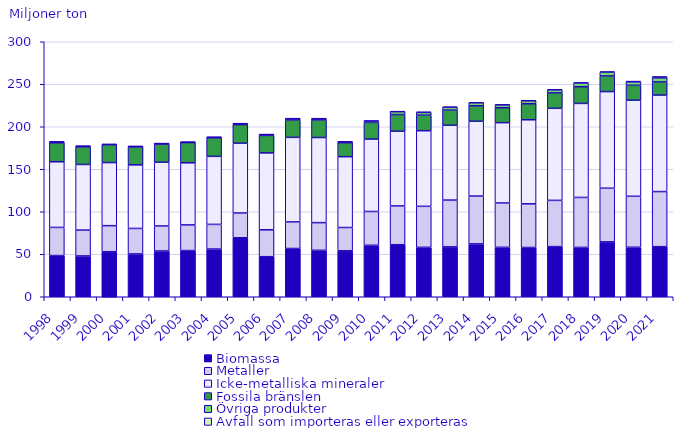
| Category | Biomassa | Metaller | Icke-metalliska mineraler | Fossila bränslen | Övriga produkter | Avfall som importeras eller exporteras |
|---|---|---|---|---|---|---|
| 1998.0 | 48.45 | 33.124 | 77.234 | 22.307 | 1.083 | 0 |
| 1999.0 | 48.012 | 30.373 | 77.263 | 20.74 | 0.784 | 0 |
| 2000.0 | 52.89 | 30.749 | 74.22 | 21.066 | 0.882 | 0 |
| 2001.0 | 50.374 | 29.982 | 74.843 | 21.147 | 0.553 | 0 |
| 2002.0 | 53.847 | 29.421 | 75.081 | 21.298 | 0.531 | 0.002 |
| 2003.0 | 54.339 | 30.173 | 73.097 | 23.796 | 0.472 | 0.002 |
| 2004.0 | 56.124 | 28.995 | 80.051 | 21.838 | 0.702 | 0.002 |
| 2005.0 | 69.391 | 29.115 | 82.129 | 21.876 | 1.108 | 0.017 |
| 2006.0 | 47.129 | 31.629 | 90.495 | 20.558 | 1.006 | 0.008 |
| 2007.0 | 56.754 | 31.276 | 99.466 | 20.378 | 1.629 | 0.013 |
| 2008.0 | 54.648 | 32.553 | 100.126 | 20.614 | 1.537 | 0.027 |
| 2009.0 | 54.057 | 27.403 | 83.328 | 16.476 | 1.024 | 0.156 |
| 2010.0 | 60.557 | 39.747 | 85.219 | 19.63 | 1.573 | 0.29 |
| 2011.0 | 61.243 | 45.578 | 87.908 | 19.643 | 3.384 | 0.46 |
| 2012.0 | 58.135 | 48.252 | 88.97 | 18.269 | 3.263 | 0.534 |
| 2013.0 | 58.709 | 55.01 | 88.057 | 17.798 | 3.334 | 0.56 |
| 2014.0 | 62.181 | 56.273 | 88.018 | 18.189 | 3.507 | 0.667 |
| 2015.0 | 58.159 | 52.17 | 94.499 | 17.548 | 3.187 | 0.671 |
| 2016.0 | 57.972 | 51.378 | 98.878 | 18.861 | 3.379 | 0.712 |
| 2017.0 | 58.996 | 54.402 | 108.309 | 18.144 | 3.511 | 0.756 |
| 2018.0 | 58.034 | 58.791 | 110.646 | 19.639 | 4.279 | 0.736 |
| 2019.0 | 64.587 | 63.088 | 113.687 | 18.422 | 4.357 | 0.773 |
| 2020.0 | 58.212 | 59.98 | 113.073 | 17.506 | 3.956 | 0.991 |
| 2021.0 | 58.925 | 64.816 | 113.543 | 15.431 | 4.795 | 1.706 |